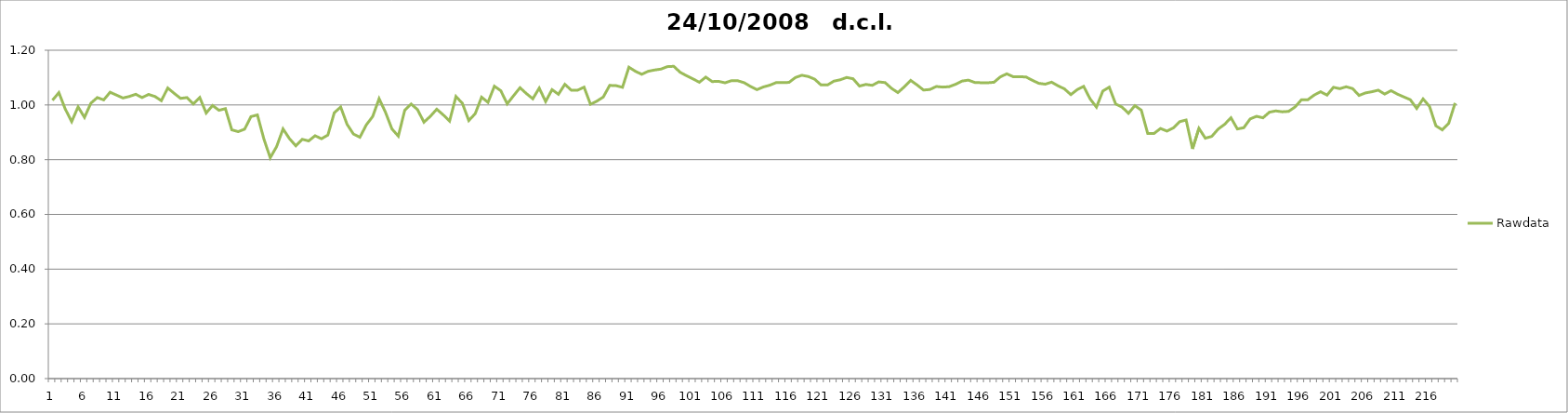
| Category | Rawdata |
|---|---|
| 0 | 1.017 |
| 1 | 1.045 |
| 2 | 0.985 |
| 3 | 0.939 |
| 4 | 0.993 |
| 5 | 0.955 |
| 6 | 1.006 |
| 7 | 1.027 |
| 8 | 1.018 |
| 9 | 1.046 |
| 10 | 1.036 |
| 11 | 1.025 |
| 12 | 1.031 |
| 13 | 1.039 |
| 14 | 1.027 |
| 15 | 1.038 |
| 16 | 1.031 |
| 17 | 1.016 |
| 18 | 1.062 |
| 19 | 1.042 |
| 20 | 1.024 |
| 21 | 1.027 |
| 22 | 1.004 |
| 23 | 1.027 |
| 24 | 0.971 |
| 25 | 0.998 |
| 26 | 0.98 |
| 27 | 0.987 |
| 28 | 0.909 |
| 29 | 0.903 |
| 30 | 0.912 |
| 31 | 0.958 |
| 32 | 0.964 |
| 33 | 0.876 |
| 34 | 0.807 |
| 35 | 0.848 |
| 36 | 0.913 |
| 37 | 0.877 |
| 38 | 0.851 |
| 39 | 0.875 |
| 40 | 0.868 |
| 41 | 0.888 |
| 42 | 0.877 |
| 43 | 0.89 |
| 44 | 0.972 |
| 45 | 0.992 |
| 46 | 0.929 |
| 47 | 0.894 |
| 48 | 0.882 |
| 49 | 0.927 |
| 50 | 0.958 |
| 51 | 1.023 |
| 52 | 0.973 |
| 53 | 0.913 |
| 54 | 0.886 |
| 55 | 0.98 |
| 56 | 1.004 |
| 57 | 0.983 |
| 58 | 0.937 |
| 59 | 0.959 |
| 60 | 0.984 |
| 61 | 0.964 |
| 62 | 0.941 |
| 63 | 1.031 |
| 64 | 1.006 |
| 65 | 0.943 |
| 66 | 0.968 |
| 67 | 1.028 |
| 68 | 1.009 |
| 69 | 1.068 |
| 70 | 1.052 |
| 71 | 1.004 |
| 72 | 1.034 |
| 73 | 1.063 |
| 74 | 1.041 |
| 75 | 1.022 |
| 76 | 1.062 |
| 77 | 1.012 |
| 78 | 1.056 |
| 79 | 1.039 |
| 80 | 1.076 |
| 81 | 1.054 |
| 82 | 1.054 |
| 83 | 1.065 |
| 84 | 1.003 |
| 85 | 1.014 |
| 86 | 1.029 |
| 87 | 1.072 |
| 88 | 1.07 |
| 89 | 1.064 |
| 90 | 1.138 |
| 91 | 1.123 |
| 92 | 1.112 |
| 93 | 1.123 |
| 94 | 1.128 |
| 95 | 1.131 |
| 96 | 1.14 |
| 97 | 1.141 |
| 98 | 1.12 |
| 99 | 1.107 |
| 100 | 1.095 |
| 101 | 1.083 |
| 102 | 1.102 |
| 103 | 1.086 |
| 104 | 1.086 |
| 105 | 1.081 |
| 106 | 1.088 |
| 107 | 1.088 |
| 108 | 1.081 |
| 109 | 1.068 |
| 110 | 1.056 |
| 111 | 1.066 |
| 112 | 1.072 |
| 113 | 1.082 |
| 114 | 1.082 |
| 115 | 1.082 |
| 116 | 1.1 |
| 117 | 1.108 |
| 118 | 1.104 |
| 119 | 1.094 |
| 120 | 1.073 |
| 121 | 1.073 |
| 122 | 1.087 |
| 123 | 1.092 |
| 124 | 1.1 |
| 125 | 1.096 |
| 126 | 1.069 |
| 127 | 1.075 |
| 128 | 1.072 |
| 129 | 1.084 |
| 130 | 1.082 |
| 131 | 1.061 |
| 132 | 1.045 |
| 133 | 1.066 |
| 134 | 1.09 |
| 135 | 1.073 |
| 136 | 1.054 |
| 137 | 1.056 |
| 138 | 1.068 |
| 139 | 1.065 |
| 140 | 1.067 |
| 141 | 1.076 |
| 142 | 1.087 |
| 143 | 1.091 |
| 144 | 1.082 |
| 145 | 1.081 |
| 146 | 1.081 |
| 147 | 1.083 |
| 148 | 1.103 |
| 149 | 1.114 |
| 150 | 1.103 |
| 151 | 1.103 |
| 152 | 1.102 |
| 153 | 1.09 |
| 154 | 1.079 |
| 155 | 1.076 |
| 156 | 1.083 |
| 157 | 1.07 |
| 158 | 1.059 |
| 159 | 1.038 |
| 160 | 1.056 |
| 161 | 1.068 |
| 162 | 1.022 |
| 163 | 0.992 |
| 164 | 1.051 |
| 165 | 1.065 |
| 166 | 1.004 |
| 167 | 0.992 |
| 168 | 0.97 |
| 169 | 0.998 |
| 170 | 0.981 |
| 171 | 0.896 |
| 172 | 0.896 |
| 173 | 0.914 |
| 174 | 0.905 |
| 175 | 0.916 |
| 176 | 0.939 |
| 177 | 0.945 |
| 178 | 0.84 |
| 179 | 0.915 |
| 180 | 0.879 |
| 181 | 0.885 |
| 182 | 0.912 |
| 183 | 0.929 |
| 184 | 0.953 |
| 185 | 0.912 |
| 186 | 0.917 |
| 187 | 0.949 |
| 188 | 0.958 |
| 189 | 0.953 |
| 190 | 0.974 |
| 191 | 0.978 |
| 192 | 0.975 |
| 193 | 0.976 |
| 194 | 0.992 |
| 195 | 1.019 |
| 196 | 1.019 |
| 197 | 1.036 |
| 198 | 1.048 |
| 199 | 1.036 |
| 200 | 1.064 |
| 201 | 1.06 |
| 202 | 1.066 |
| 203 | 1.06 |
| 204 | 1.035 |
| 205 | 1.044 |
| 206 | 1.048 |
| 207 | 1.054 |
| 208 | 1.04 |
| 209 | 1.052 |
| 210 | 1.039 |
| 211 | 1.029 |
| 212 | 1.019 |
| 213 | 0.987 |
| 214 | 1.022 |
| 215 | 0.995 |
| 216 | 0.924 |
| 217 | 0.909 |
| 218 | 0.933 |
| 219 | 1.007 |